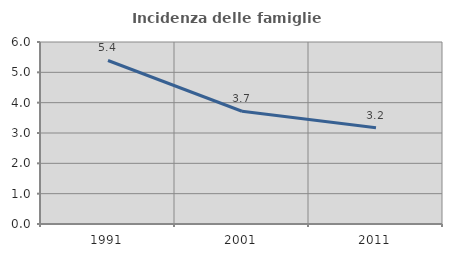
| Category | Incidenza delle famiglie numerose |
|---|---|
| 1991.0 | 5.39 |
| 2001.0 | 3.717 |
| 2011.0 | 3.175 |